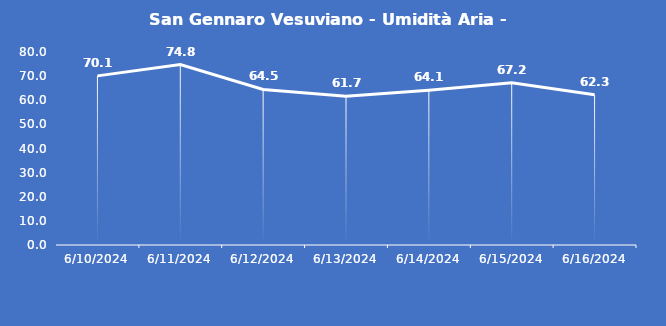
| Category | San Gennaro Vesuviano - Umidità Aria - Grezzo (%) |
|---|---|
| 6/10/24 | 70.1 |
| 6/11/24 | 74.8 |
| 6/12/24 | 64.5 |
| 6/13/24 | 61.7 |
| 6/14/24 | 64.1 |
| 6/15/24 | 67.2 |
| 6/16/24 | 62.3 |